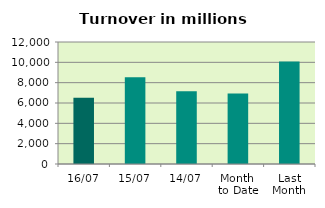
| Category | Series 0 |
|---|---|
| 16/07 | 6506.691 |
| 15/07 | 8523.067 |
| 14/07 | 7148.786 |
| Month 
to Date | 6926.272 |
| Last
Month | 10085.686 |